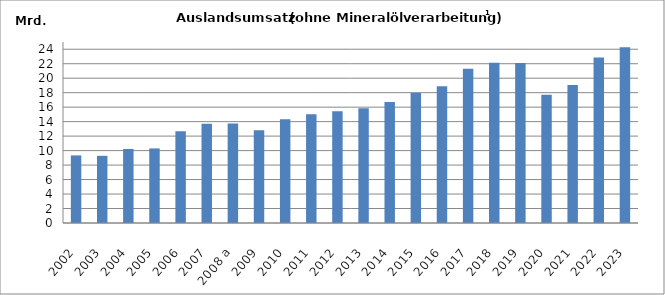
| Category | Series 0 |
|---|---|
| 2002  | 9333876.194 |
| 2003 | 9280061.294 |
| 2004 | 10227412.62 |
| 2005 | 10298460.421 |
| 2006  | 12658471.838 |
| 2007 | 13722597.678 |
| 2008 a | 13747366.687 |
| 2009 | 12808832.69 |
| 2010  | 14321679.718 |
| 2011 | 15018937.533 |
| 2012  | 15435287.933 |
| 2013  | 15854090.158 |
| 2014  | 16718170.123 |
| 2015  | 17944142.383 |
| 2016  | 18894048.431 |
| 2017  | 21311172.808 |
| 2018  | 22141164.77 |
| 2019  | 22114399.679 |
| 2020  | 17704809.081 |
| 2021  | 19072263.273 |
| 2022  | 22849763.907 |
| 2023  | 24271572.977 |